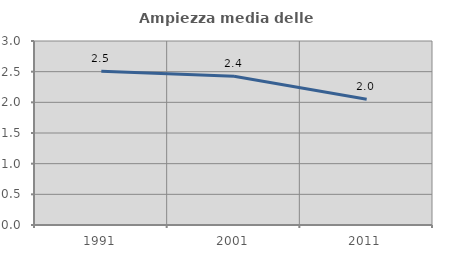
| Category | Ampiezza media delle famiglie |
|---|---|
| 1991.0 | 2.506 |
| 2001.0 | 2.424 |
| 2011.0 | 2.049 |